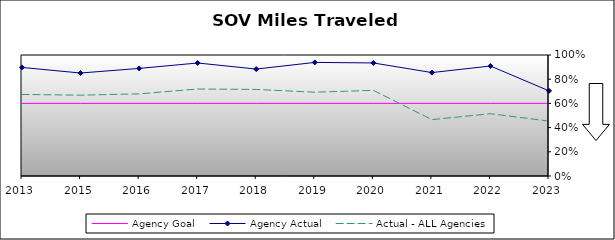
| Category | Agency Goal | Agency Actual | Actual - ALL Agencies |
|---|---|---|---|
| 2013.0 | 0.6 | 0.897 | 0.674 |
| 2015.0 | 0.6 | 0.851 | 0.668 |
| 2016.0 | 0.6 | 0.889 | 0.679 |
| 2017.0 | 0.6 | 0.934 | 0.719 |
| 2018.0 | 0.6 | 0.884 | 0.715 |
| 2019.0 | 0.6 | 0.939 | 0.692 |
| 2020.0 | 0.6 | 0.934 | 0.708 |
| 2021.0 | 0.6 | 0.855 | 0.466 |
| 2022.0 | 0.6 | 0.909 | 0.515 |
| 2023.0 | 0.6 | 0.704 | 0.454 |